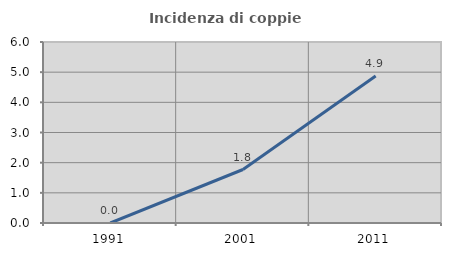
| Category | Incidenza di coppie miste |
|---|---|
| 1991.0 | 0 |
| 2001.0 | 1.773 |
| 2011.0 | 4.87 |